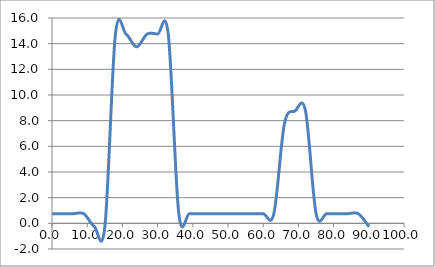
| Category | Elevation (in.) |
|---|---|
| 0.024 | 0.75 |
| 3.024 | 0.75 |
| 6.024 | 0.75 |
| 9.024000000000001 | 0.75 |
| 12.024000000000001 | -0.25 |
| 15.024000000000001 | -0.25 |
| 18.024 | 14.75 |
| 21.024 | 14.75 |
| 24.023999999999997 | 13.75 |
| 27.023999999999997 | 14.75 |
| 30.023999999999997 | 14.75 |
| 33.024 | 14.75 |
| 36.024 | 0.75 |
| 39.024 | 0.75 |
| 42.024 | 0.75 |
| 45.024 | 0.75 |
| 48.024 | 0.75 |
| 51.024 | 0.75 |
| 54.024 | 0.75 |
| 57.024 | 0.75 |
| 60.024 | 0.75 |
| 63.024 | 0.75 |
| 66.024 | 7.75 |
| 69.024 | 8.75 |
| 72.024 | 8.75 |
| 75.024 | 0.75 |
| 78.024 | 0.75 |
| 81.024 | 0.75 |
| 84.024 | 0.75 |
| 87.024 | 0.75 |
| 90.024 | -0.25 |